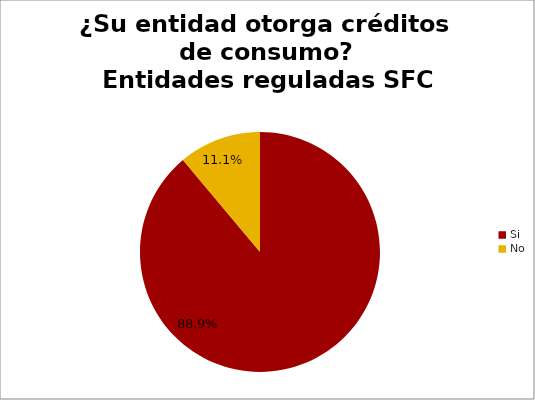
| Category | ¿Su entidad otorga créditos de consumo? Entidades reguladas SFC |
|---|---|
| Si | 0.889 |
| No | 0.111 |